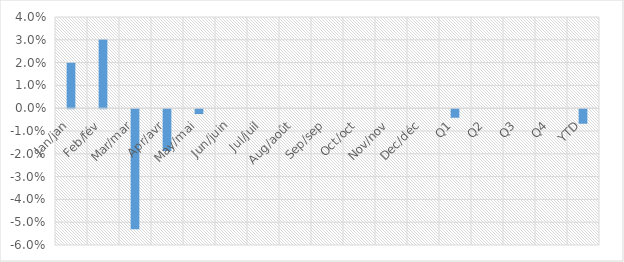
| Category | Total YoY % Change |
|---|---|
| Jan/jan | 0.02 |
| Feb/fév | 0.03 |
| Mar/mar | -0.053 |
| Apr/avr | -0.018 |
| May/mai | -0.002 |
| Jun/juin | 0 |
| Jul/juil | 0 |
| Aug/août | 0 |
| Sep/sep | 0 |
| Oct/oct | 0 |
| Nov/nov | 0 |
| Dec/déc | 0 |
| Q1 | -0.004 |
| Q2 | 0 |
| Q3 | 0 |
| Q4 | 0 |
| YTD | -0.006 |